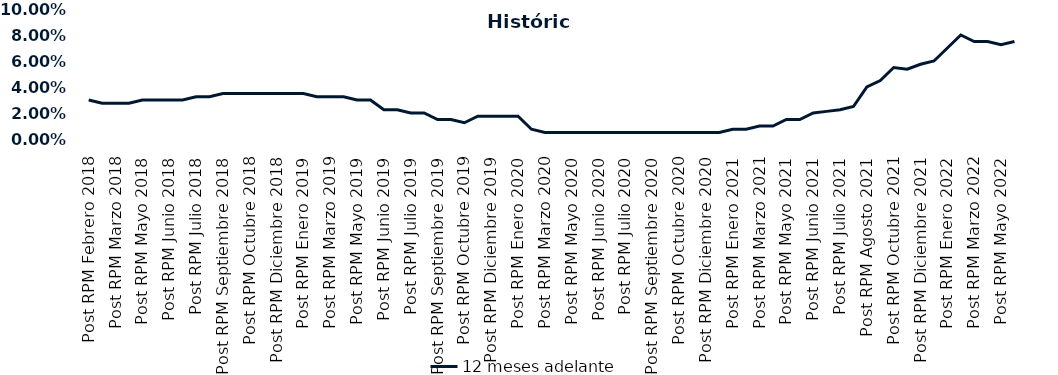
| Category | 12 meses adelante  |
|---|---|
| Post RPM Febrero 2018 | 0.03 |
| Pre RPM Marzo 2018 | 0.028 |
| Post RPM Marzo 2018 | 0.028 |
| Pre RPM Mayo 2018 | 0.028 |
| Post RPM Mayo 2018 | 0.03 |
| Pre RPM Junio 2018 | 0.03 |
| Post RPM Junio 2018 | 0.03 |
| Pre RPM Julio 2018 | 0.03 |
| Post RPM Julio 2018 | 0.032 |
| Pre RPM Septiembre 2018 | 0.032 |
| Post RPM Septiembre 2018 | 0.035 |
| Pre RPM Octubre 2018 | 0.035 |
| Post RPM Octubre 2018 | 0.035 |
| Pre RPM Diciembre 2018 | 0.035 |
| Post RPM Diciembre 2018 | 0.035 |
| Pre RPM Enero 2019 | 0.035 |
| Post RPM Enero 2019 | 0.035 |
| Pre RPM Marzo 2019 | 0.032 |
| Post RPM Marzo 2019 | 0.032 |
| Pre RPM Mayo 2019 | 0.032 |
| Post RPM Mayo 2019 | 0.03 |
| Pre RPM Junio 2019 | 0.03 |
| Post RPM Junio 2019 | 0.022 |
| Pre RPM Julio 2019 | 0.022 |
| Post RPM Julio 2019 | 0.02 |
| Pre RPM Septiembre 2019 | 0.02 |
| Post RPM Septiembre 2019 | 0.015 |
| Pre RPM Octubre 2019 | 0.015 |
| Post RPM Octubre 2019 | 0.012 |
| Pre RPM Diciembre 2019 | 0.018 |
| Post RPM Diciembre 2019 | 0.018 |
| Pre RPM Enero 2020 | 0.018 |
| Post RPM Enero 2020 | 0.018 |
| Pre RPM Marzo 2020 | 0.008 |
| Post RPM Marzo 2020 | 0.005 |
| Pre RPM Mayo 2020 | 0.005 |
| Post RPM Mayo 2020 | 0.005 |
| Pre RPM Junio 2020 | 0.005 |
| Post RPM Junio 2020 | 0.005 |
| Pre RPM Julio 2020 | 0.005 |
| Post RPM Julio 2020 | 0.005 |
| Pre RPM Septiembre 2020 | 0.005 |
| Post RPM Septiembre 2020 | 0.005 |
| Pre RPM Octubre 2020 | 0.005 |
| Post RPM Octubre 2020 | 0.005 |
| Pre RPM Diciembre 2020 | 0.005 |
| Post RPM Diciembre 2020 | 0.005 |
| Pre RPM Enero 2021 | 0.005 |
| Post RPM Enero 2021 | 0.008 |
| Pre RPM Marzo 2021 | 0.008 |
| Post RPM Marzo 2021 | 0.01 |
| Pre RPM Mayo 2021 | 0.01 |
| Post RPM Mayo 2021 | 0.015 |
| Pre RPM Junio 2021 | 0.015 |
| Post RPM Junio 2021 | 0.02 |
| Pre RPM Julio 2021 | 0.021 |
| Post RPM Julio 2021 | 0.022 |
| Pre RPM Agosto 2021 | 0.025 |
| Post RPM Agosto 2021 | 0.04 |
| Pre RPM Octubre 2021 | 0.045 |
| Post RPM Octubre 2021 | 0.055 |
| Pre RPM Diciembre 2021 | 0.054 |
| Post RPM Diciembre 2021 | 0.058 |
| Pre RPM Enero 2022 | 0.06 |
| Post RPM Enero 2022 | 0.07 |
| Pre RPM Marzo 2022 | 0.08 |
| Post RPM Marzo 2022 | 0.075 |
| Pre RPM Mayo 2022 | 0.075 |
| Post RPM Mayo 2022 | 0.072 |
| Pre RPM Junio 2022 | 0.075 |